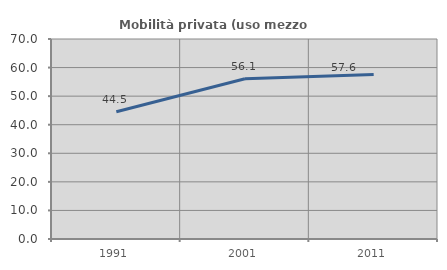
| Category | Mobilità privata (uso mezzo privato) |
|---|---|
| 1991.0 | 44.545 |
| 2001.0 | 56.08 |
| 2011.0 | 57.555 |